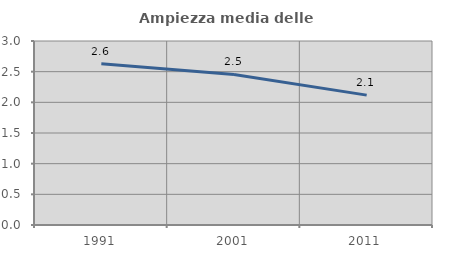
| Category | Ampiezza media delle famiglie |
|---|---|
| 1991.0 | 2.629 |
| 2001.0 | 2.454 |
| 2011.0 | 2.117 |